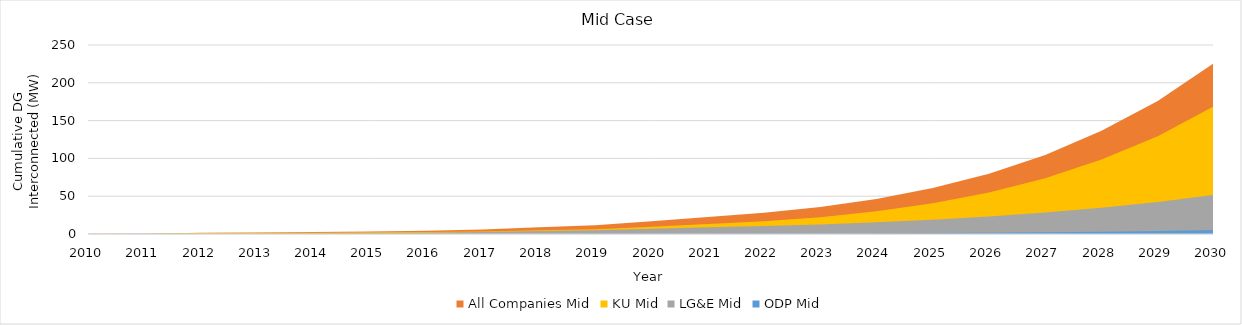
| Category | All Companies Mid | KU Mid | LG&E Mid | ODP Mid |
|---|---|---|---|---|
| 2010.0 | 0.25 | 0.11 | 0.139 | 0 |
| 2011.0 | 0.41 | 0.155 | 0.256 | 0 |
| 2012.0 | 1.776 | 1.437 | 0.327 | 0.012 |
| 2013.0 | 2.052 | 1.527 | 0.514 | 0.012 |
| 2014.0 | 2.507 | 1.7 | 0.796 | 0.012 |
| 2015.0 | 3.342 | 2.17 | 1.161 | 0.012 |
| 2016.0 | 4.238 | 2.706 | 1.505 | 0.027 |
| 2017.0 | 5.964 | 3.315 | 2.613 | 0.036 |
| 2018.0 | 8.998 | 5.091 | 3.862 | 0.045 |
| 2019.0 | 11.501 | 6.335 | 4.965 | 0.201 |
| 2020.0 | 16.751 | 9.494 | 6.977 | 0.28 |
| 2021.0 | 22.503 | 13.189 | 8.889 | 0.425 |
| 2022.0 | 28.028 | 16.892 | 10.55 | 0.564 |
| 2023.0 | 35.778 | 22.289 | 12.709 | 0.75 |
| 2024.0 | 46.434 | 29.946 | 15.446 | 1.004 |
| 2025.0 | 60.847 | 40.602 | 18.855 | 1.341 |
| 2026.0 | 79.726 | 54.88 | 22.997 | 1.788 |
| 2027.0 | 104.458 | 73.639 | 28.388 | 2.356 |
| 2028.0 | 136.42 | 98.401 | 34.857 | 3.07 |
| 2029.0 | 175.982 | 129.425 | 42.413 | 4.032 |
| 2030.0 | 226.229 | 169.182 | 51.751 | 5.158 |